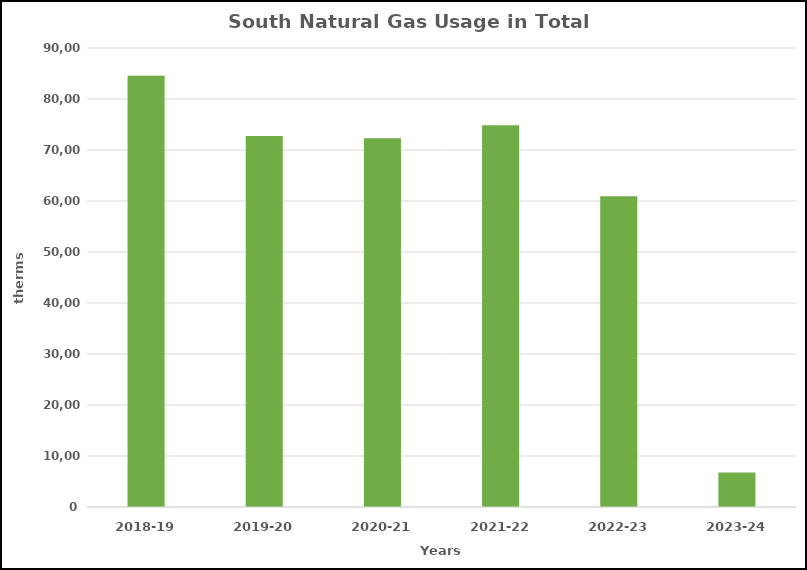
| Category | Series 0 |
|---|---|
| 2018-19 | 84558 |
| 2019-20 | 72736 |
| 2020-21 | 72285 |
| 2021-22 | 74830 |
| 2022-23 | 60914 |
| 2023-24 | 6769 |